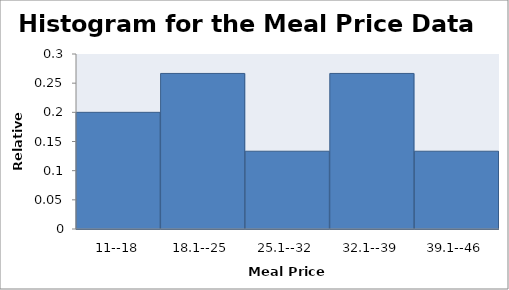
| Category | Series 0 |
|---|---|
| 11--18 | 0.2 |
| 18.1--25 | 0.267 |
| 25.1--32 | 0.133 |
| 32.1--39 | 0.267 |
| 39.1--46 | 0.133 |